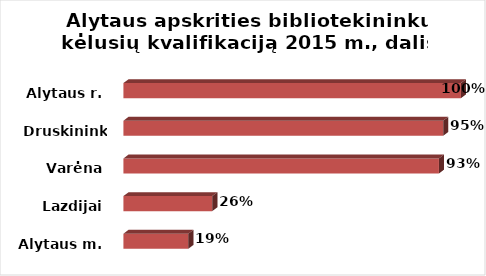
| Category | Series 0 |
|---|---|
| Alytaus m. | 0.192 |
| Lazdijai | 0.263 |
| Varėna | 0.935 |
| Druskininkai | 0.947 |
| Alytaus r. | 1 |